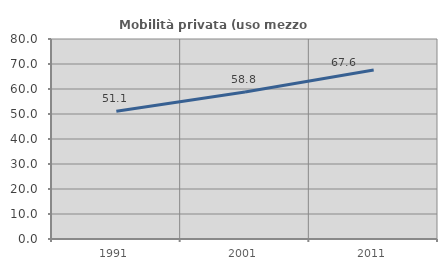
| Category | Mobilità privata (uso mezzo privato) |
|---|---|
| 1991.0 | 51.087 |
| 2001.0 | 58.824 |
| 2011.0 | 67.619 |